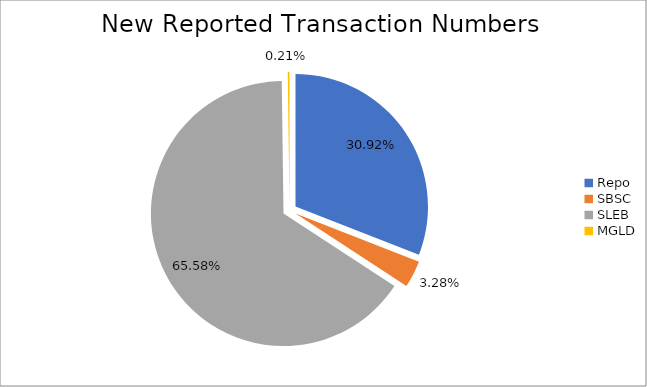
| Category | Series 0 |
|---|---|
| Repo | 406371 |
| SBSC | 43166 |
| SLEB | 861818 |
| MGLD | 2771 |